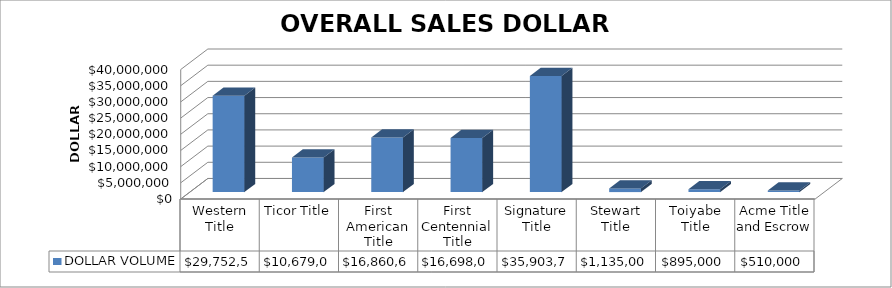
| Category | DOLLAR VOLUME |
|---|---|
| Western Title | 29752548 |
| Ticor Title | 10679000 |
| First American Title | 16860600 |
| First Centennial Title | 16698000 |
| Signature Title | 35903750 |
| Stewart Title | 1135000 |
| Toiyabe Title | 895000 |
| Acme Title and Escrow | 510000 |